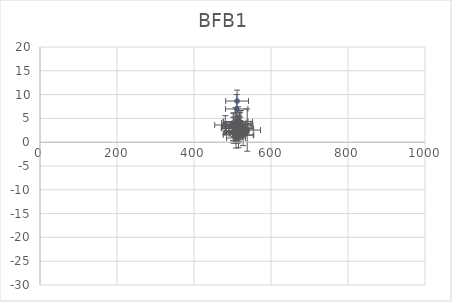
| Category | BFB1 |
|---|---|
| 538.2289088528519 | 2.544 |
| 501.84486866545245 | 3.219 |
| 518.2324019587088 | 3.568 |
| 514.4143389407441 | 4.307 |
| 512.0122797528156 | 8.645 |
| 519.571078084118 | 3.766 |
| 520.422705120105 | 3.147 |
| 510.9305548204578 | 6.982 |
| 508.1305848798492 | 4.326 |
| 502.6303256229243 | 3.18 |
| 481.36283885910757 | 3.618 |
| 503.4335973327576 | 4.05 |
| 503.3271266413353 | 3.206 |
| 527.5389555381939 | 1.441 |
| 513.9744307321271 | 1.82 |
| 522.1442134433612 | 3.904 |
| 520.3334775406837 | 2.549 |
| 511.62649653730466 | 2.245 |
| 509.2055622412332 | 2.373 |
| 509.1546522658838 | 0.879 |
| 513.3818468396864 | 2.346 |
| 502.81700292125737 | 1.943 |
| 508.8824777022375 | 1.851 |
| 516.8452249479685 | 1.993 |
| 515.3459370190768 | 3.164 |
| 515.7394985586329 | 1.545 |
| 512.9121652606509 | 2.881 |
| 511.3871707534645 | 2.056 |
| 503.58581322218106 | 2.008 |
| 514.5456624239372 | 3.601 |